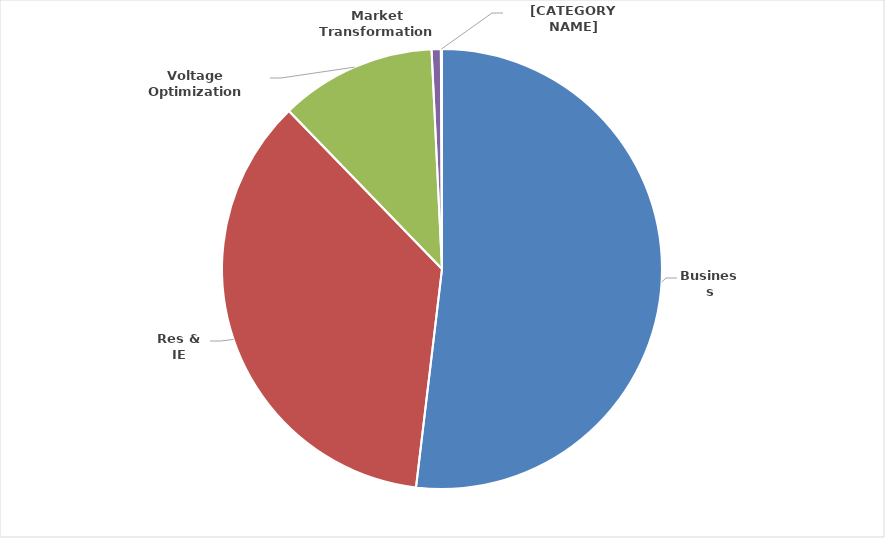
| Category | Series 0 |
|---|---|
| Business | 812481895 |
| Res & IE | 561600765 |
| Voltage Optimization | 179982384 |
| Market Transformation | 10602499.5 |
| Pilot | 1272072.9 |